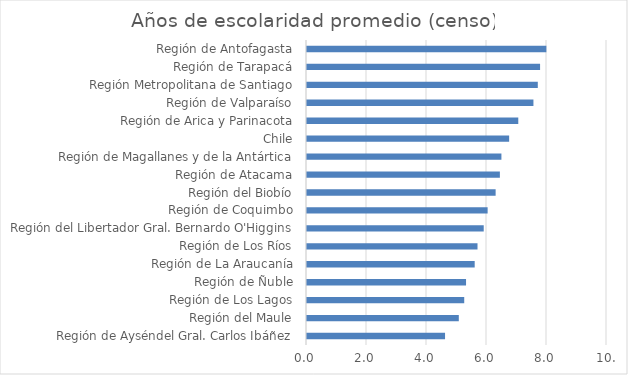
| Category | Años de escolaridad promedio (censo) |
|---|---|
| Región de Ayséndel Gral. Carlos Ibáñez | 4.602 |
| Región del Maule | 5.06 |
| Región de Los Lagos | 5.241 |
| Región de Ñuble | 5.301 |
| Región de La Araucanía | 5.59 |
| Región de Los Ríos | 5.684 |
| Región del Libertador Gral. Bernardo O'Higgins | 5.891 |
| Región de Coquimbo | 6.021 |
| Región del Biobío | 6.288 |
| Región de Atacama | 6.429 |
| Región de Magallanes y de la Antártica | 6.48 |
| Chile | 6.738 |
| Región de Arica y Parinacota | 7.042 |
| Región de Valparaíso | 7.548 |
| Región Metropolitana de Santiago | 7.693 |
| Región de Tarapacá | 7.769 |
| Región de Antofagasta | 7.979 |